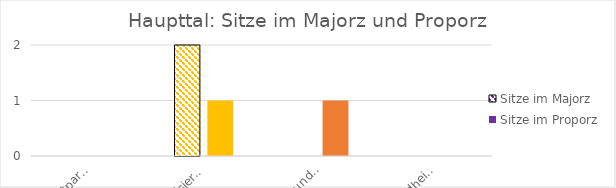
| Category | Sitze im Majorz | Sitze im Proporz |
|---|---|---|
| Umweltpartei | 0 | 0 |
| Digitalisierungspartei | 2 | 1 |
| Sport- und Kulturpartei | 0 | 1 |
| Gesundheitspartei | 0 | 0 |